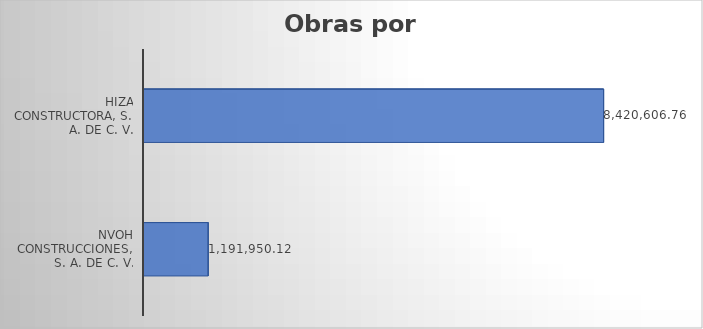
| Category | Monto |
|---|---|
| Nvoh Construcciones, S. A. de C. V. | 1191950.12 |
| Hiza Constructora, S. A. de C. V. | 8420606.76 |